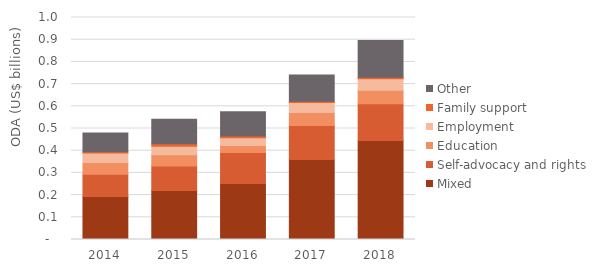
| Category | Mixed | Self-advocacy and rights | Education | Employment | Family support | Other |
|---|---|---|---|---|---|---|
| 2014.0 | 0.194 | 0.1 | 0.053 | 0.043 | 0.006 | 0.085 |
| 2015.0 | 0.221 | 0.11 | 0.051 | 0.039 | 0.011 | 0.11 |
| 2016.0 | 0.252 | 0.139 | 0.032 | 0.035 | 0.008 | 0.109 |
| 2017.0 | 0.361 | 0.153 | 0.059 | 0.045 | 0.005 | 0.118 |
| 2018.0 | 0.446 | 0.165 | 0.061 | 0.052 | 0.008 | 0.165 |